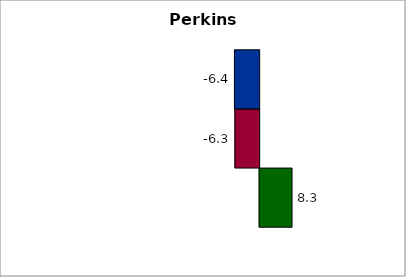
| Category | State | SREB states | 50 states and D.C. |
|---|---|---|---|
| 0 | 8.35 | -6.253 | -6.369 |